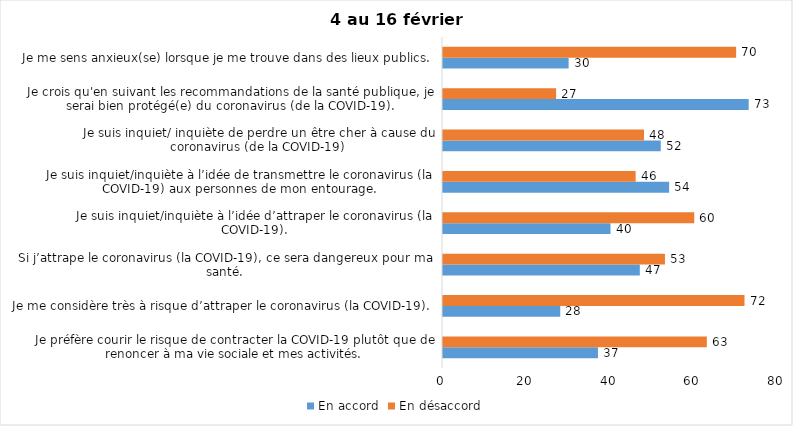
| Category | En accord | En désaccord |
|---|---|---|
| Je préfère courir le risque de contracter la COVID-19 plutôt que de renoncer à ma vie sociale et mes activités. | 37 | 63 |
| Je me considère très à risque d’attraper le coronavirus (la COVID-19). | 28 | 72 |
| Si j’attrape le coronavirus (la COVID-19), ce sera dangereux pour ma santé. | 47 | 53 |
| Je suis inquiet/inquiète à l’idée d’attraper le coronavirus (la COVID-19). | 40 | 60 |
| Je suis inquiet/inquiète à l’idée de transmettre le coronavirus (la COVID-19) aux personnes de mon entourage. | 54 | 46 |
| Je suis inquiet/ inquiète de perdre un être cher à cause du coronavirus (de la COVID-19) | 52 | 48 |
| Je crois qu'en suivant les recommandations de la santé publique, je serai bien protégé(e) du coronavirus (de la COVID-19). | 73 | 27 |
| Je me sens anxieux(se) lorsque je me trouve dans des lieux publics. | 30 | 70 |